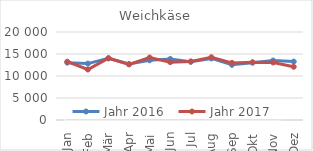
| Category | Jahr 2016 | Jahr 2017 |
|---|---|---|
| Jan | 13035.199 | 13258.034 |
| Feb | 12823.102 | 11475.149 |
| Mär | 14018.212 | 14037.732 |
| Apr | 12711.556 | 12635.304 |
| Mai | 13563.42 | 14199.986 |
| Jun | 13867.365 | 13144.663 |
| Jul | 13223.078 | 13313.629 |
| Aug | 13991.508 | 14261.546 |
| Sep | 12539.727 | 12982.214 |
| Okt | 13029.799 | 13116.5 |
| Nov | 13513.31 | 13072.823 |
| Dez | 13275.16 | 12098.262 |